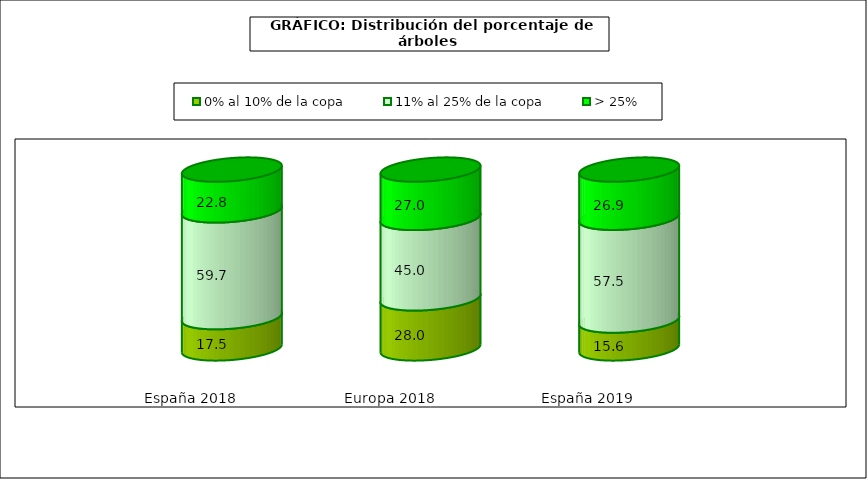
| Category | 0% al 10% de la copa | 11% al 25% de la copa | > 25% |
|---|---|---|---|
| España 2018 | 17.5 | 59.7 | 22.8 |
| Europa 2018 | 28 | 45 | 27 |
| España 2019 | 15.6 | 57.5 | 26.9 |